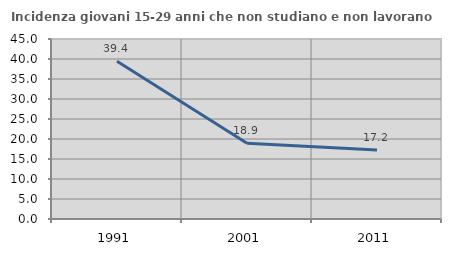
| Category | Incidenza giovani 15-29 anni che non studiano e non lavorano  |
|---|---|
| 1991.0 | 39.429 |
| 2001.0 | 18.947 |
| 2011.0 | 17.22 |